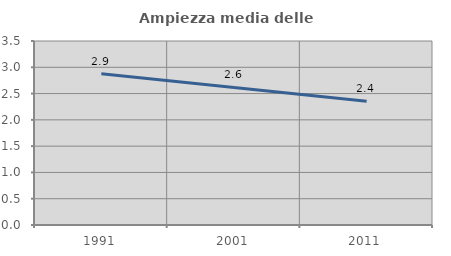
| Category | Ampiezza media delle famiglie |
|---|---|
| 1991.0 | 2.876 |
| 2001.0 | 2.617 |
| 2011.0 | 2.355 |